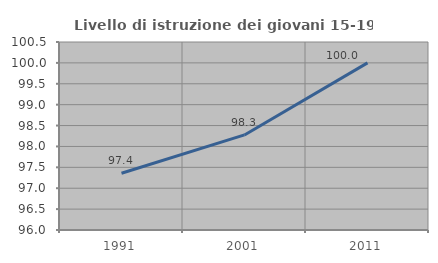
| Category | Livello di istruzione dei giovani 15-19 anni |
|---|---|
| 1991.0 | 97.36 |
| 2001.0 | 98.276 |
| 2011.0 | 100 |